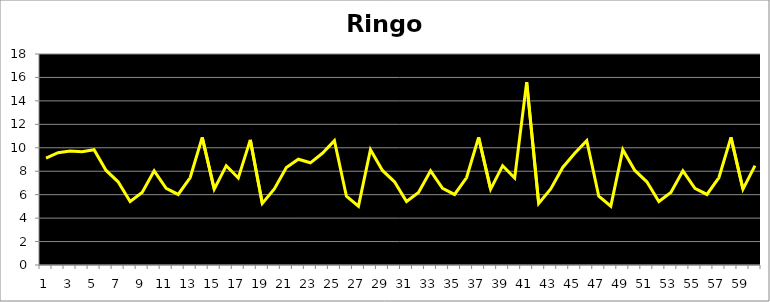
| Category | Ringo |
|---|---|
| 0 | 9.112 |
| 1 | 9.582 |
| 2 | 9.734 |
| 3 | 9.655 |
| 4 | 9.84 |
| 5 | 8.066 |
| 6 | 7.099 |
| 7 | 5.417 |
| 8 | 6.193 |
| 9 | 8.037 |
| 10 | 6.54 |
| 11 | 6.018 |
| 12 | 7.462 |
| 13 | 10.888 |
| 14 | 6.469 |
| 15 | 8.474 |
| 16 | 7.427 |
| 17 | 10.676 |
| 18 | 5.253 |
| 19 | 6.486 |
| 20 | 8.319 |
| 21 | 9.023 |
| 22 | 8.718 |
| 23 | 9.53 |
| 24 | 10.608 |
| 25 | 5.869 |
| 26 | 5.018 |
| 27 | 9.84 |
| 28 | 8.066 |
| 29 | 7.099 |
| 30 | 5.417 |
| 31 | 6.193 |
| 32 | 8.037 |
| 33 | 6.54 |
| 34 | 6.018 |
| 35 | 7.462 |
| 36 | 10.888 |
| 37 | 6.469 |
| 38 | 8.474 |
| 39 | 7.427 |
| 40 | 15.598 |
| 41 | 5.253 |
| 42 | 6.486 |
| 43 | 8.319 |
| 44 | 9.53 |
| 45 | 10.608 |
| 46 | 5.869 |
| 47 | 5.018 |
| 48 | 9.84 |
| 49 | 8.066 |
| 50 | 7.099 |
| 51 | 5.417 |
| 52 | 6.193 |
| 53 | 8.037 |
| 54 | 6.54 |
| 55 | 6.018 |
| 56 | 7.462 |
| 57 | 10.888 |
| 58 | 6.469 |
| 59 | 8.474 |